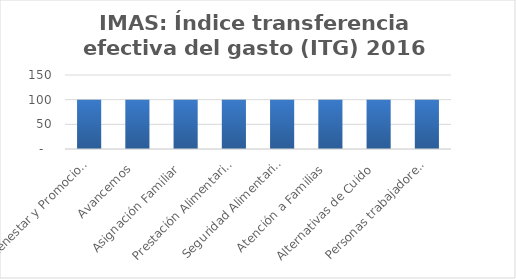
| Category | Índice transferencia efectiva del gasto (ITG) |
|---|---|
| Bienestar y Promocion Familiar | 100 |
| Avancemos | 100 |
| Asignación Familiar | 100 |
| Prestación Alimentaria | 100 |
| Seguridad Alimentaria | 100 |
| Atención a Familias | 100 |
| Alternativas de Cuido | 100 |
| Personas trabajadores menores de edad | 100 |